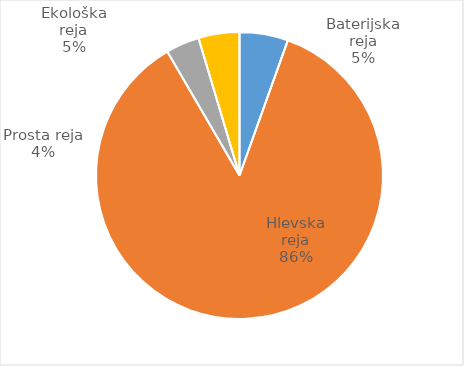
| Category | Število kosov jajc |
|---|---|
| Baterijska reja | 142809 |
| Hlevska reja | 2250146 |
| Prosta reja | 98868 |
| Ekološka reja | 120480 |